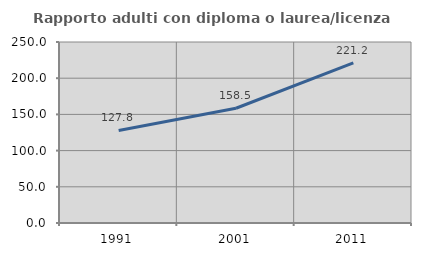
| Category | Rapporto adulti con diploma o laurea/licenza media  |
|---|---|
| 1991.0 | 127.833 |
| 2001.0 | 158.525 |
| 2011.0 | 221.204 |